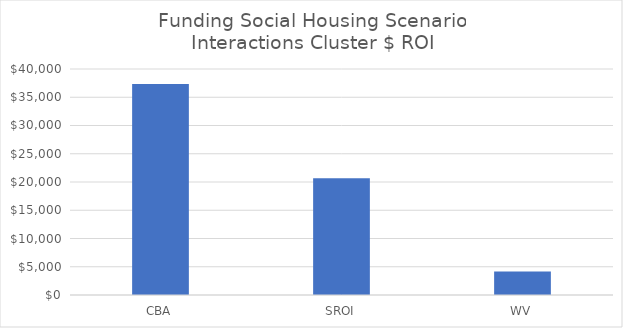
| Category | Interactions |
|---|---|
| CBA | 37344.9 |
| SROI | 20670 |
| WV | 4176.9 |